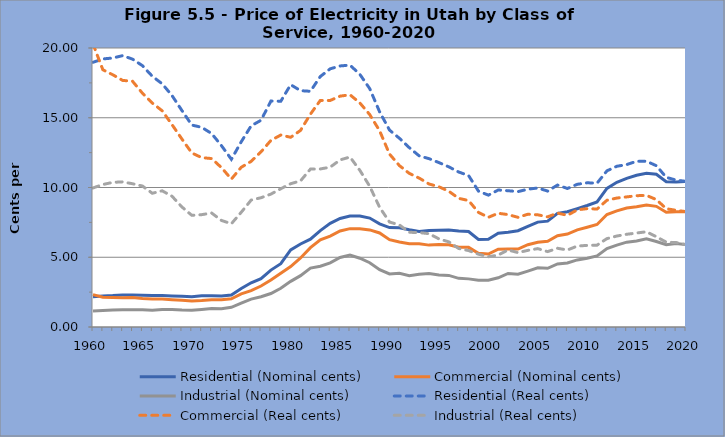
| Category | Residential (Nominal cents) | Commercial (Nominal cents) | Industrial (Nominal cents) | Residential (Real cents) | Commercial (Real cents) | Industrial (Real cents) |
|---|---|---|---|---|---|---|
| 1960.0 | 2.17 | 2.32 | 1.14 | 18.974 | 20.285 | 9.968 |
| 1961.0 | 2.22 | 2.13 | 1.18 | 19.216 | 18.437 | 10.214 |
| 1962.0 | 2.25 | 2.11 | 1.21 | 19.282 | 18.082 | 10.37 |
| 1963.0 | 2.3 | 2.09 | 1.23 | 19.453 | 17.677 | 10.403 |
| 1964.0 | 2.3 | 2.11 | 1.23 | 19.202 | 17.616 | 10.269 |
| 1965.0 | 2.28 | 2.04 | 1.23 | 18.733 | 16.761 | 10.106 |
| 1966.0 | 2.25 | 2.01 | 1.2 | 17.973 | 16.056 | 9.586 |
| 1967.0 | 2.25 | 2 | 1.26 | 17.435 | 15.498 | 9.764 |
| 1968.0 | 2.23 | 1.95 | 1.26 | 16.585 | 14.502 | 9.371 |
| 1969.0 | 2.2 | 1.91 | 1.22 | 15.515 | 13.469 | 8.604 |
| 1970.0 | 2.17 | 1.87 | 1.2 | 14.475 | 12.474 | 8.004 |
| 1971.0 | 2.24 | 1.9 | 1.26 | 14.314 | 12.142 | 8.052 |
| 1972.0 | 2.24 | 1.95 | 1.32 | 13.869 | 12.074 | 8.173 |
| 1973.0 | 2.23 | 1.96 | 1.31 | 12.999 | 11.425 | 7.636 |
| 1974.0 | 2.29 | 2.02 | 1.41 | 12.022 | 10.604 | 7.402 |
| 1975.0 | 2.76 | 2.38 | 1.71 | 13.277 | 11.449 | 8.226 |
| 1976.0 | 3.17 | 2.61 | 2 | 14.419 | 11.872 | 9.097 |
| 1977.0 | 3.47 | 2.94 | 2.17 | 14.82 | 12.556 | 9.268 |
| 1978.0 | 4.08 | 3.37 | 2.4 | 16.196 | 13.377 | 9.527 |
| 1979.0 | 4.54 | 3.86 | 2.78 | 16.185 | 13.76 | 9.91 |
| 1980.0 | 5.53 | 4.33 | 3.27 | 17.369 | 13.6 | 10.271 |
| 1981.0 | 5.95 | 4.95 | 3.68 | 16.941 | 14.094 | 10.478 |
| 1982.0 | 6.3 | 5.69 | 4.22 | 16.896 | 15.26 | 11.318 |
| 1983.0 | 6.91 | 6.25 | 4.36 | 17.956 | 16.241 | 11.329 |
| 1984.0 | 7.43 | 6.52 | 4.6 | 18.508 | 16.241 | 11.458 |
| 1985.0 | 7.78 | 6.88 | 4.98 | 18.713 | 16.549 | 11.978 |
| 1986.0 | 7.95 | 7.05 | 5.16 | 18.773 | 16.648 | 12.185 |
| 1987.0 | 7.95 | 7.05 | 4.93 | 18.112 | 16.062 | 11.232 |
| 1988.0 | 7.81 | 6.96 | 4.61 | 17.086 | 15.227 | 10.086 |
| 1989.0 | 7.39 | 6.74 | 4.11 | 15.424 | 14.068 | 8.578 |
| 1990.0 | 7.13 | 6.26 | 3.8 | 14.119 | 12.396 | 7.525 |
| 1991.0 | 7.12 | 6.09 | 3.85 | 13.53 | 11.572 | 7.316 |
| 1992.0 | 6.97 | 5.97 | 3.68 | 12.858 | 11.013 | 6.788 |
| 1993.0 | 6.85 | 5.96 | 3.78 | 12.269 | 10.675 | 6.77 |
| 1994.0 | 6.91 | 5.87 | 3.83 | 12.067 | 10.251 | 6.689 |
| 1995.0 | 6.94 | 5.92 | 3.72 | 11.786 | 10.054 | 6.317 |
| 1996.0 | 6.96 | 5.9 | 3.7 | 11.481 | 9.732 | 6.103 |
| 1997.0 | 6.89 | 5.72 | 3.49 | 11.11 | 9.224 | 5.628 |
| 1998.0 | 6.84 | 5.71 | 3.45 | 10.861 | 9.066 | 5.478 |
| 1999.0 | 6.27 | 5.29 | 3.36 | 9.74 | 8.218 | 5.22 |
| 2000.0 | 6.29 | 5.23 | 3.35 | 9.454 | 7.861 | 5.035 |
| 2001.0 | 6.72 | 5.58 | 3.53 | 9.82 | 8.155 | 5.159 |
| 2002.0 | 6.79 | 5.6 | 3.84 | 9.768 | 8.056 | 5.524 |
| 2003.0 | 6.9 | 5.59 | 3.79 | 9.705 | 7.863 | 5.331 |
| 2004.0 | 7.21 | 5.9 | 4.01 | 9.878 | 8.084 | 5.494 |
| 2005.0 | 7.52 | 6.07 | 4.24 | 9.965 | 8.044 | 5.619 |
| 2006.0 | 7.59 | 6.15 | 4.21 | 9.744 | 7.895 | 5.405 |
| 2007.0 | 8.15 | 6.54 | 4.52 | 10.175 | 8.165 | 5.643 |
| 2008.0 | 8.26 | 6.66 | 4.59 | 9.929 | 8.006 | 5.518 |
| 2009.0 | 8.48 | 6.96 | 4.81 | 10.23 | 8.396 | 5.803 |
| 2010.0 | 8.71 | 7.15 | 4.93 | 10.338 | 8.486 | 5.851 |
| 2011.0 | 8.96 | 7.35 | 5.1 | 10.309 | 8.457 | 5.868 |
| 2012.0 | 9.93 | 8.06 | 5.62 | 11.194 | 9.086 | 6.335 |
| 2013.0 | 10.37 | 8.32 | 5.87 | 11.521 | 9.243 | 6.521 |
| 2014.0 | 10.65 | 8.53 | 6.08 | 11.643 | 9.325 | 6.647 |
| 2015.0 | 10.88 | 8.62 | 6.17 | 11.88 | 9.413 | 6.737 |
| 2016.0 | 11.02 | 8.75 | 6.33 | 11.883 | 9.436 | 6.826 |
| 2017.0 | 10.95 | 8.65 | 6.13 | 11.562 | 9.133 | 6.472 |
| 2018.0 | 10.41 | 8.23 | 5.9 | 10.729 | 8.482 | 6.081 |
| 2019.0 | 10.4 | 8.26 | 5.98 | 10.528 | 8.362 | 6.054 |
| 2020.0 | 10.44 | 8.27 | 5.9 | 10.44 | 8.27 | 5.9 |